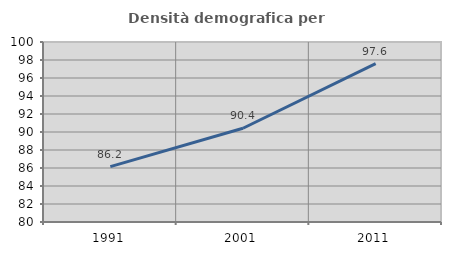
| Category | Densità demografica |
|---|---|
| 1991.0 | 86.157 |
| 2001.0 | 90.419 |
| 2011.0 | 97.591 |